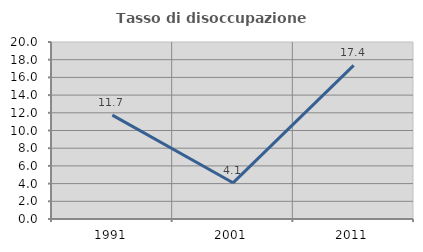
| Category | Tasso di disoccupazione giovanile  |
|---|---|
| 1991.0 | 11.739 |
| 2001.0 | 4.089 |
| 2011.0 | 17.355 |